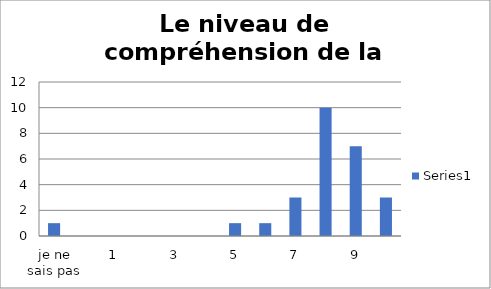
| Category | Series 0 |
|---|---|
| je ne sais pas | 1 |
| 0 | 0 |
| 1 | 0 |
| 2 | 0 |
| 3 | 0 |
| 4 | 0 |
| 5 | 1 |
| 6 | 1 |
| 7 | 3 |
| 8 | 10 |
| 9 | 7 |
| 10 | 3 |